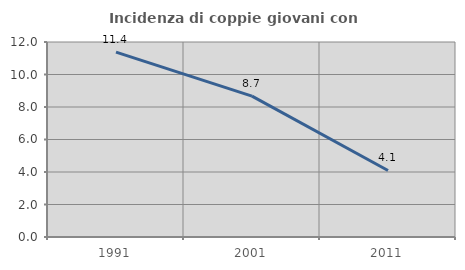
| Category | Incidenza di coppie giovani con figli |
|---|---|
| 1991.0 | 11.377 |
| 2001.0 | 8.671 |
| 2011.0 | 4.094 |